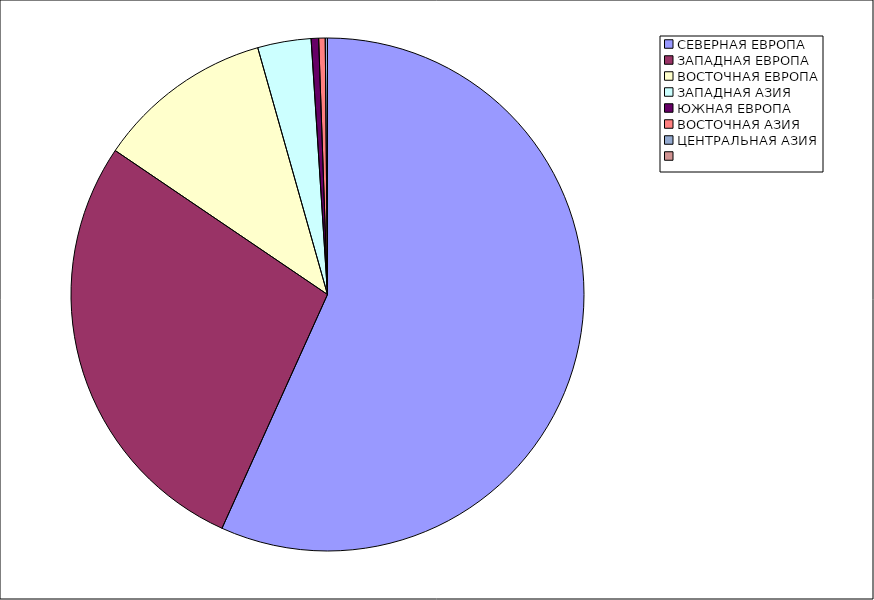
| Category | Оборот |
|---|---|
| СЕВЕРНАЯ ЕВРОПА | 56.747 |
| ЗАПАДНАЯ ЕВРОПА | 27.738 |
| ВОСТОЧНАЯ ЕВРОПА | 11.131 |
| ЗАПАДНАЯ АЗИЯ | 3.363 |
| ЮЖНАЯ ЕВРОПА | 0.471 |
| ВОСТОЧНАЯ АЗИЯ | 0.41 |
| ЦЕНТРАЛЬНАЯ АЗИЯ | 0.14 |